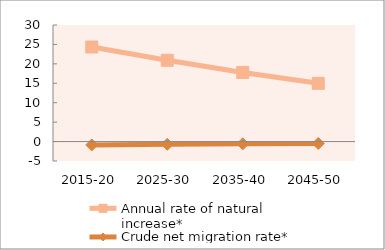
| Category | Annual rate of natural increase* | Crude net migration rate* |
|---|---|---|
| 2015-20 | 24.338 | -0.869 |
| 2025-30 | 20.921 | -0.698 |
| 2035-40 | 17.783 | -0.579 |
| 2045-50 | 14.984 | -0.495 |